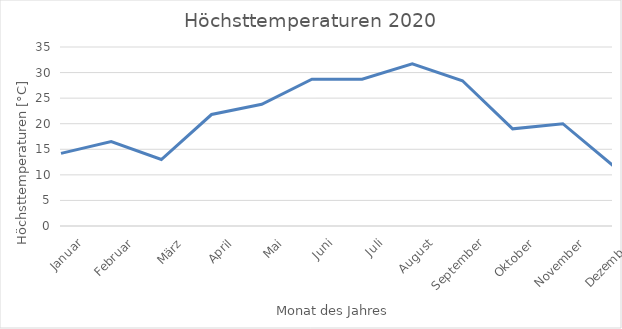
| Category | Series 0 |
|---|---|
| Januar | 14.2 |
| Februar | 16.5 |
| März | 13 |
| April | 21.8 |
| Mai | 23.8 |
| Juni | 28.7 |
| Juli | 28.7 |
| August | 31.7 |
| September | 28.4 |
| Oktober | 19 |
| November | 20 |
| Dezember | 11.8 |